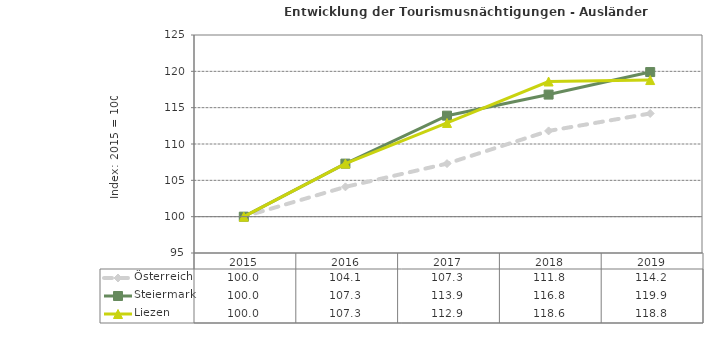
| Category | Österreich | Steiermark | Liezen |
|---|---|---|---|
| 2019.0 | 114.2 | 119.9 | 118.8 |
| 2018.0 | 111.8 | 116.8 | 118.6 |
| 2017.0 | 107.3 | 113.9 | 112.9 |
| 2016.0 | 104.1 | 107.3 | 107.3 |
| 2015.0 | 100 | 100 | 100 |